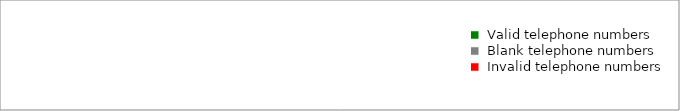
| Category | Series 0 |
|---|---|
|  Valid telephone numbers  | 0 |
|  Blank telephone numbers  | 0 |
|  Invalid telephone numbers  | 0 |